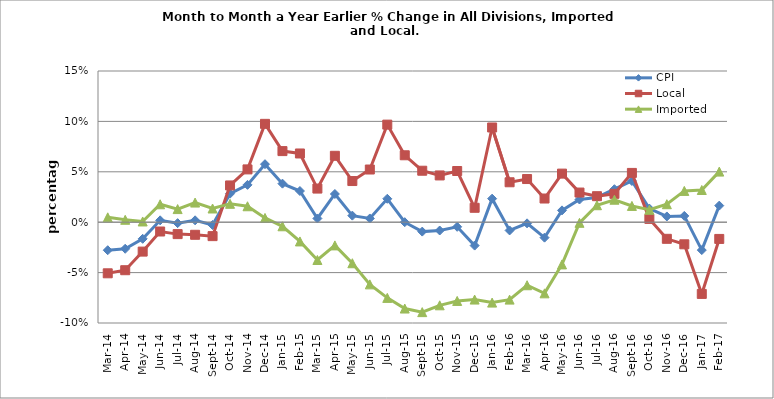
| Category | CPI | Local | Imported |
|---|---|---|---|
| 2014-03-02 | -0.028 | -0.051 | 0.005 |
| 2014-04-02 | -0.026 | -0.048 | 0.002 |
| 2014-05-02 | -0.016 | -0.029 | 0.001 |
| 2014-06-02 | 0.002 | -0.009 | 0.018 |
| 2014-07-02 | -0.001 | -0.012 | 0.013 |
| 2014-08-02 | 0.002 | -0.012 | 0.019 |
| 2014-09-02 | -0.003 | -0.014 | 0.014 |
| 2014-10-02 | 0.028 | 0.036 | 0.018 |
| 2014-11-02 | 0.037 | 0.052 | 0.016 |
| 2014-12-02 | 0.058 | 0.098 | 0.004 |
| 2015-01-02 | 0.038 | 0.071 | -0.004 |
| 2015-02-02 | 0.031 | 0.068 | -0.019 |
| 2015-03-02 | 0.004 | 0.033 | -0.037 |
| 2015-04-02 | 0.028 | 0.066 | -0.023 |
| 2015-05-01 | 0.007 | 0.041 | -0.041 |
| 2015-06-01 | 0.004 | 0.052 | -0.062 |
| 2015-07-01 | 0.023 | 0.097 | -0.075 |
| 2015-08-01 | 0 | 0.066 | -0.086 |
| 2015-09-01 | -0.009 | 0.051 | -0.089 |
| 2015-10-01 | -0.008 | 0.046 | -0.082 |
| 2015-11-01 | -0.005 | 0.051 | -0.078 |
| 2015-12-01 | -0.023 | 0.014 | -0.077 |
| 2016-01-01 | 0.023 | 0.094 | -0.08 |
| 2016-02-01 | -0.008 | 0.04 | -0.077 |
| 2016-03-01 | -0.001 | 0.043 | -0.063 |
| 2016-04-01 | -0.015 | 0.023 | -0.071 |
| 2016-05-01 | 0.012 | 0.048 | -0.042 |
| 2016-06-01 | 0.023 | 0.029 | -0.001 |
| 2016-07-01 | 0.025 | 0.026 | 0.017 |
| 2016-08-01 | 0.033 | 0.028 | 0.022 |
| 2016-09-01 | 0.041 | 0.049 | 0.016 |
| 2016-10-01 | 0.014 | 0.003 | 0.012 |
| 2016-11-01 | 0.006 | -0.016 | 0.018 |
| 2016-12-01 | 0.006 | -0.022 | 0.031 |
| 2017-01-01 | -0.028 | -0.071 | 0.032 |
| 2017-02-01 | 0.016 | -0.017 | 0.05 |